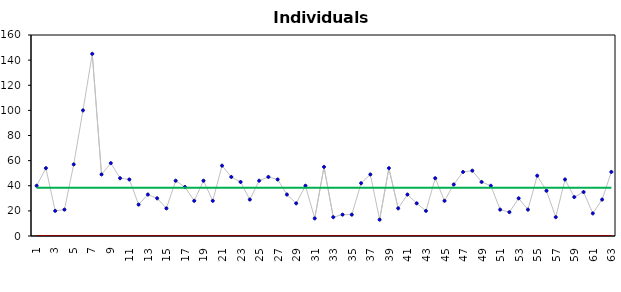
| Category | My Output | UCL | LCL | Mean |
|---|---|---|---|---|
| 1.0 | 13 | 88.531 | -12.595 | 37.968 |
| 2.0 | 48 | 88.531 | -12.595 | 37.968 |
| 3.0 | 12 | 88.531 | -12.595 | 37.968 |
| 4.0 | 13 | 88.531 | -12.595 | 37.968 |
| 5.0 | 25 | 88.531 | -12.595 | 37.968 |
| 6.0 | 100 | 88.531 | -12.595 | 37.968 |
| 7.0 | 145 | 88.531 | -12.595 | 37.968 |
| 8.0 | 19 | 88.531 | -12.595 | 37.968 |
| 9.0 | 36 | 88.531 | -12.595 | 37.968 |
| 10.0 | 34 | 88.531 | -12.595 | 37.968 |
| 11.0 | 37 | 88.531 | -12.595 | 37.968 |
| 12.0 | 13 | 88.531 | -12.595 | 37.968 |
| 13.0 | 36 | 88.531 | -12.595 | 37.968 |
| 14.0 | 34 | 88.531 | -12.595 | 37.968 |
| 15.0 | 57 | 88.531 | -12.595 | 37.968 |
| 16.0 | 42 | 88.531 | -12.595 | 37.968 |
| 17.0 | 25 | 88.531 | -12.595 | 37.968 |
| 18.0 | 41 | 88.531 | -12.595 | 37.968 |
| 19.0 | 26 | 88.531 | -12.595 | 37.968 |
| 20.0 | 22 | 88.531 | -12.595 | 37.968 |
| 21.0 | 56 | 88.531 | -12.595 | 37.968 |
| 22.0 | 52 | 88.531 | -12.595 | 37.968 |
| 23.0 | 52 | 88.531 | -12.595 | 37.968 |
| 24.0 | 31 | 88.531 | -12.595 | 37.968 |
| 25.0 | 51 | 88.531 | -12.595 | 37.968 |
| 26.0 | 26 | 88.531 | -12.595 | 37.968 |
| 27.0 | 56 | 88.531 | -12.595 | 37.968 |
| 28.0 | 14 | 88.531 | -12.595 | 37.968 |
| 29.0 | 40 | 88.531 | -12.595 | 37.968 |
| 30.0 | 53 | 88.531 | -12.595 | 37.968 |
| 31.0 | 29 | 88.531 | -12.595 | 37.968 |
| 32.0 | 53 | 88.531 | -12.595 | 37.968 |
| 33.0 | 41 | 88.531 | -12.595 | 37.968 |
| 34.0 | 12 | 88.531 | -12.595 | 37.968 |
| 35.0 | 34 | 88.531 | -12.595 | 37.968 |
| 36.0 | 27 | 88.531 | -12.595 | 37.968 |
| 37.0 | 22 | 88.531 | -12.595 | 37.968 |
| 38.0 | 30 | 88.531 | -12.595 | 37.968 |
| 39.0 | 17 | 88.531 | -12.595 | 37.968 |
| 40.0 | 17 | 88.531 | -12.595 | 37.968 |
| 41.0 | 51 | 88.531 | -12.595 | 37.968 |
| 42.0 | 16 | 88.531 | -12.595 | 37.968 |
| 43.0 | 47 | 88.531 | -12.595 | 37.968 |
| 44.0 | 34 | 88.531 | -12.595 | 37.968 |
| 45.0 | 58 | 88.531 | -12.595 | 37.968 |
| 46.0 | 59 | 88.531 | -12.595 | 37.968 |
| 47.0 | 55 | 88.531 | -12.595 | 37.968 |
| 48.0 | 49 | 88.531 | -12.595 | 37.968 |
| 49.0 | 47 | 88.531 | -12.595 | 37.968 |
| 50.0 | 57 | 88.531 | -12.595 | 37.968 |
| 51.0 | 15 | 88.531 | -12.595 | 37.968 |
| 52.0 | 36 | 88.531 | -12.595 | 37.968 |
| 53.0 | 37 | 88.531 | -12.595 | 37.968 |
| 54.0 | 28 | 88.531 | -12.595 | 37.968 |
| 55.0 | 28 | 88.531 | -12.595 | 37.968 |
| 56.0 | 22 | 88.531 | -12.595 | 37.968 |
| 57.0 | 45 | 88.531 | -12.595 | 37.968 |
| 58.0 | 38 | 88.531 | -12.595 | 37.968 |
| 59.0 | 29 | 88.531 | -12.595 | 37.968 |
| 60.0 | 28 | 88.531 | -12.595 | 37.968 |
| 61.0 | 25 | 88.531 | -12.595 | 37.968 |
| 62.0 | 51 | 88.531 | -12.595 | 37.968 |
| 63.0 | 46 | 88.531 | -12.595 | 37.968 |